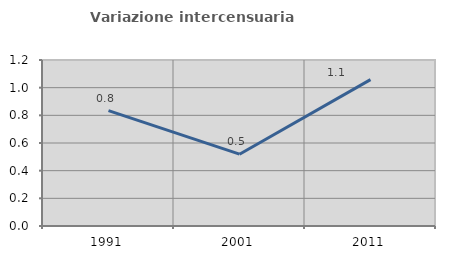
| Category | Variazione intercensuaria annua |
|---|---|
| 1991.0 | 0.834 |
| 2001.0 | 0.519 |
| 2011.0 | 1.058 |